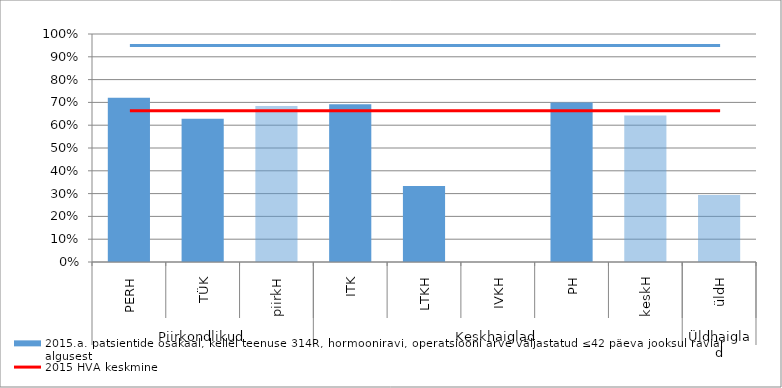
| Category | 2015.a. patsientide osakaal, kellel teenuse 314R, hormooniravi, operatsiooni arve väljastatud ≤42 päeva jooksul raviarve algusest |
|---|---|
| 0 | 0.721 |
| 1 | 0.629 |
| 2 | 0.684 |
| 3 | 0.692 |
| 4 | 0.333 |
| 5 | 0 |
| 6 | 0.7 |
| 7 | 0.643 |
| 8 | 0.294 |